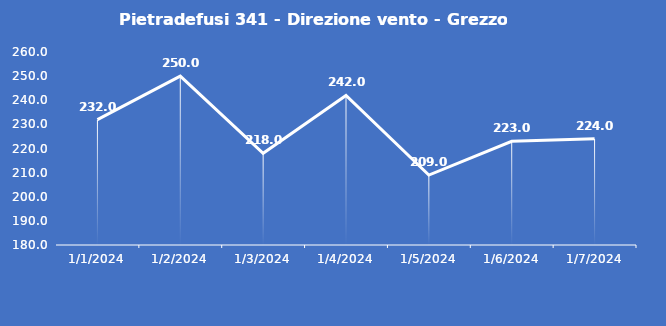
| Category | Pietradefusi 341 - Direzione vento - Grezzo (°N) |
|---|---|
| 1/1/24 | 232 |
| 1/2/24 | 250 |
| 1/3/24 | 218 |
| 1/4/24 | 242 |
| 1/5/24 | 209 |
| 1/6/24 | 223 |
| 1/7/24 | 224 |